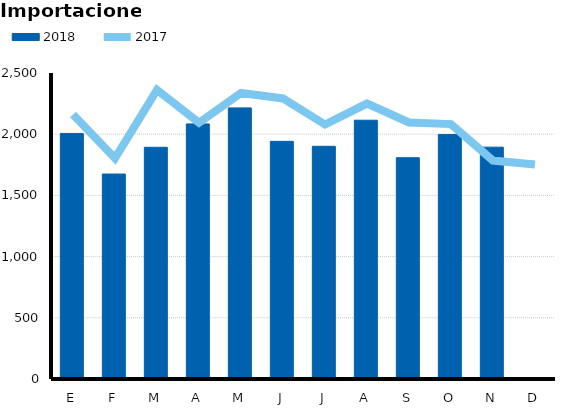
| Category | 2018 |
|---|---|
| E | 2006.183 |
| F | 1674.532 |
| M | 1893.101 |
| A | 2084.035 |
| M | 2214.866 |
| J | 1941.478 |
| J | 1901.137 |
| A | 2114.146 |
| S | 1807.969 |
| O | 1998.035 |
| N | 1894.254 |
| D | 0 |